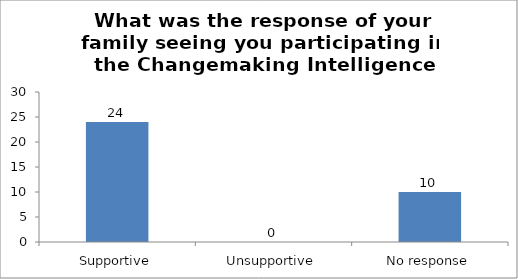
| Category | What was the response of your family seeing you participating in the Changemaking Intelligence Test? |
|---|---|
| Supportive | 24 |
| Unsupportive | 0 |
| No response | 10 |